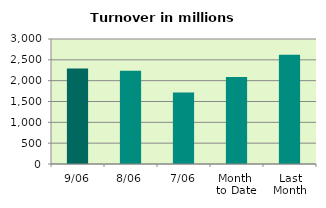
| Category | Series 0 |
|---|---|
| 9/06 | 2289.474 |
| 8/06 | 2240.274 |
| 7/06 | 1717.544 |
| Month 
to Date | 2086.803 |
| Last
Month | 2619.784 |